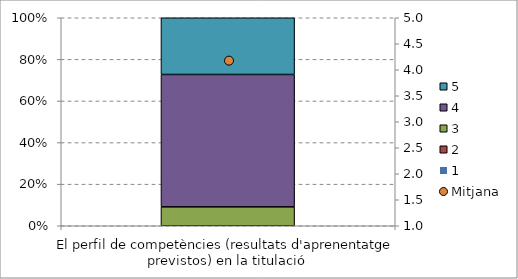
| Category | 1 | 2 | 3 | 4 | 5 |
|---|---|---|---|---|---|
| El perfil de competències (resultats d'aprenentatge previstos) en la titulació | 0 | 0 | 0.091 | 0.636 | 0.273 |